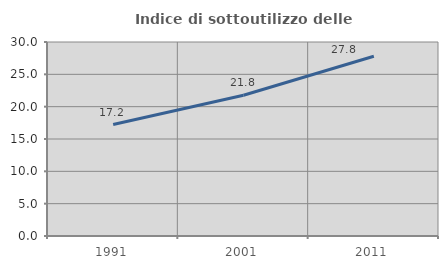
| Category | Indice di sottoutilizzo delle abitazioni  |
|---|---|
| 1991.0 | 17.231 |
| 2001.0 | 21.764 |
| 2011.0 | 27.797 |